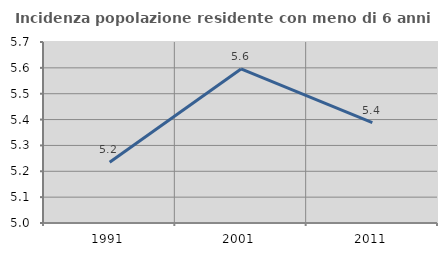
| Category | Incidenza popolazione residente con meno di 6 anni |
|---|---|
| 1991.0 | 5.235 |
| 2001.0 | 5.596 |
| 2011.0 | 5.388 |